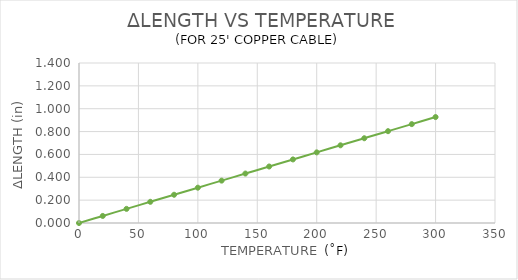
| Category | Series 0 |
|---|---|
| 0.0 | 0 |
| 20.0 | 0.062 |
| 40.0 | 0.124 |
| 60.0 | 0.185 |
| 80.0 | 0.247 |
| 100.0 | 0.309 |
| 120.0 | 0.371 |
| 140.0 | 0.433 |
| 160.0 | 0.494 |
| 180.0 | 0.556 |
| 200.0 | 0.618 |
| 220.0 | 0.68 |
| 240.0 | 0.742 |
| 260.0 | 0.803 |
| 280.0 | 0.865 |
| 300.0 | 0.927 |